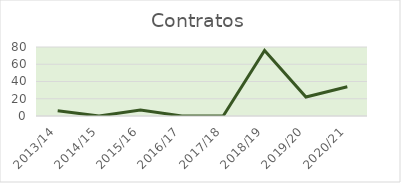
| Category | Contratos |
|---|---|
| 2013/14 | 6 |
| 2014/15 | 0 |
| 2015/16 | 7 |
| 2016/17 | 0 |
| 2017/18 | 0 |
| 2018/19 | 76 |
| 2019/20 | 22 |
| 2020/21 | 34 |